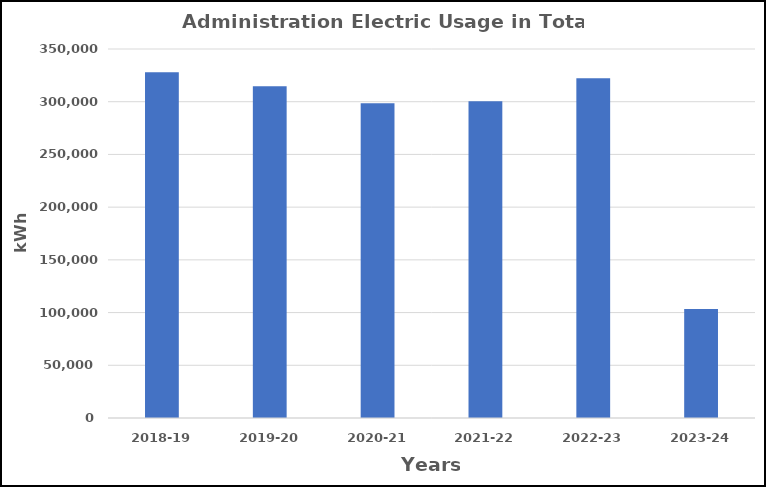
| Category | Series 0 |
|---|---|
| 2018-19 | 327849 |
| 2019-20 | 314581 |
| 2020-21 | 298481 |
| 2021-22 | 300514 |
| 2022-23 | 322298 |
| 2023-24 | 103330 |